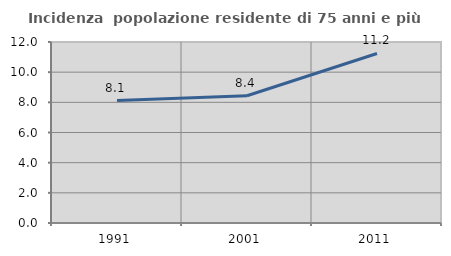
| Category | Incidenza  popolazione residente di 75 anni e più |
|---|---|
| 1991.0 | 8.118 |
| 2001.0 | 8.434 |
| 2011.0 | 11.241 |